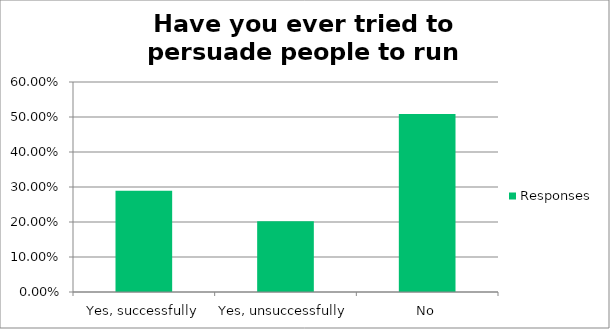
| Category | Responses |
|---|---|
| Yes, successfully | 0.289 |
| Yes, unsuccessfully | 0.202 |
| No | 0.509 |